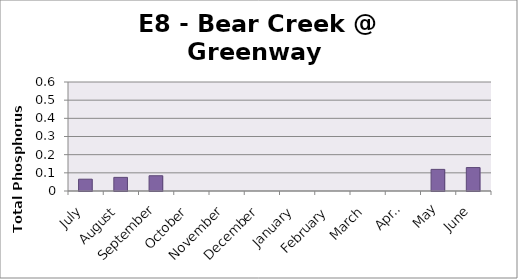
| Category | Phosphorus (mg/L) |
|---|---|
| July | 0.065 |
| August | 0.075 |
| September | 0.084 |
| October | 0 |
| November | 0 |
| December | 0 |
| January | 0 |
| February | 0 |
| March | 0 |
| April | 0 |
| May | 0.119 |
| June | 0.129 |